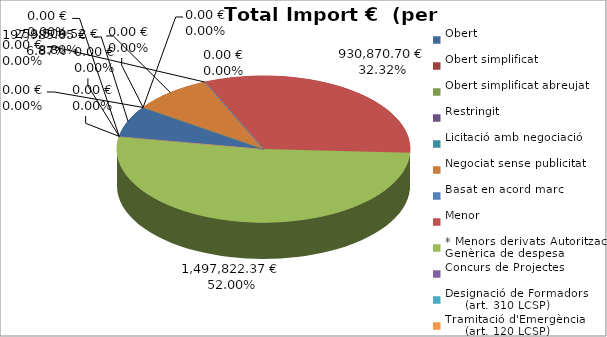
| Category | Total preu
(amb IVA) |
|---|---|
| Obert | 197985.65 |
| Obert simplificat | 0 |
| Obert simplificat abreujat | 0 |
| Restringit | 0 |
| Licitació amb negociació | 0 |
| Negociat sense publicitat | 253509.52 |
| Basat en acord marc | 0 |
| Menor | 930870.7 |
| * Menors derivats Autorització Genèrica de despesa | 1497822.37 |
| Concurs de Projectes | 0 |
| Designació de Formadors
     (art. 310 LCSP) | 0 |
| Tramitació d'Emergència
     (art. 120 LCSP) | 0 |